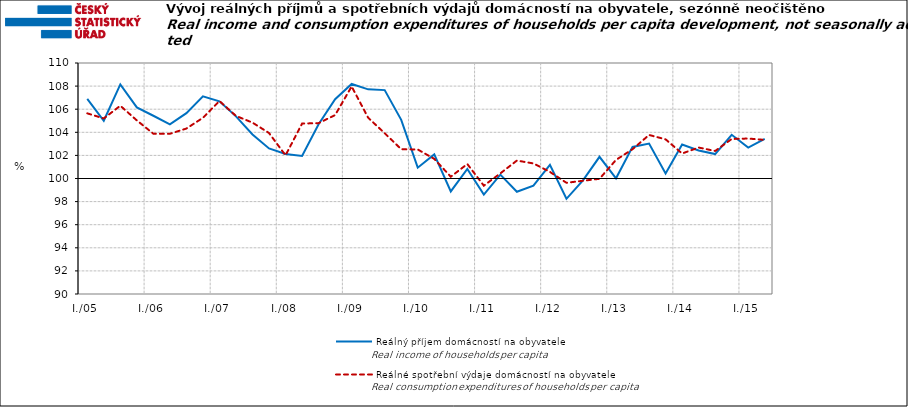
| Category | Reálný příjem domácností na obyvatele | Reálné spotřební výdaje domácností na obyvatele |
|---|---|---|
| I./05 | 106.901 | 105.642 |
|  | 104.997 | 105.199 |
|  | 108.148 | 106.3 |
|  | 106.154 | 105.031 |
| I./06 | 105.434 | 103.879 |
|  | 104.689 | 103.87 |
|  | 105.658 | 104.326 |
|  | 107.116 | 105.256 |
| I./07 | 106.678 | 106.711 |
|  | 105.38 | 105.42 |
|  | 103.808 | 104.837 |
|  | 102.605 | 103.939 |
| I./08 | 102.123 | 102.003 |
|  | 101.954 | 104.757 |
|  | 104.699 | 104.794 |
|  | 106.864 | 105.492 |
| I./09 | 108.183 | 107.97 |
|  | 107.717 | 105.261 |
|  | 107.653 | 103.919 |
|  | 105.076 | 102.535 |
| I./10 | 100.936 | 102.513 |
|  | 102.09 | 101.699 |
|  | 98.881 | 100.155 |
|  | 100.828 | 101.253 |
| I./11 | 98.606 | 99.379 |
|  | 100.332 | 100.444 |
|  | 98.849 | 101.552 |
|  | 99.386 | 101.305 |
| I./12 | 101.189 | 100.571 |
|  | 98.242 | 99.628 |
|  | 99.844 | 99.805 |
|  | 101.878 | 99.972 |
| I./13 | 100.014 | 101.61 |
|  | 102.735 | 102.534 |
|  | 103.03 | 103.769 |
|  | 100.433 | 103.39 |
| I./14 | 102.938 | 102.164 |
|  | 102.425 | 102.681 |
|  | 102.116 | 102.384 |
|  | 103.781 | 103.423 |
| I./15 | 102.682 | 103.46 |